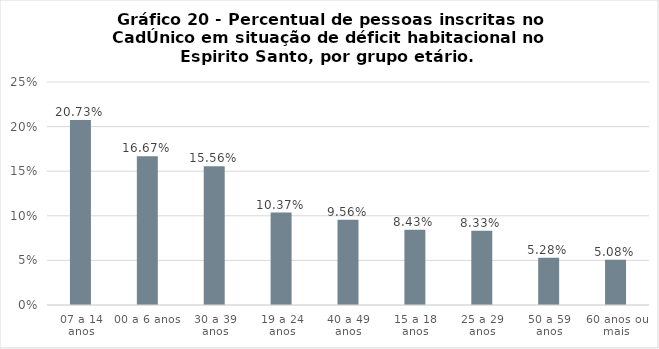
| Category | Series 0 |
|---|---|
| 07 a 14 anos | 0.207 |
| 00 a 6 anos | 0.167 |
| 30 a 39 anos | 0.156 |
| 19 a 24 anos | 0.104 |
| 40 a 49 anos | 0.096 |
| 15 a 18 anos | 0.084 |
| 25 a 29 anos | 0.083 |
| 50 a 59 anos | 0.053 |
| 60 anos ou mais | 0.051 |